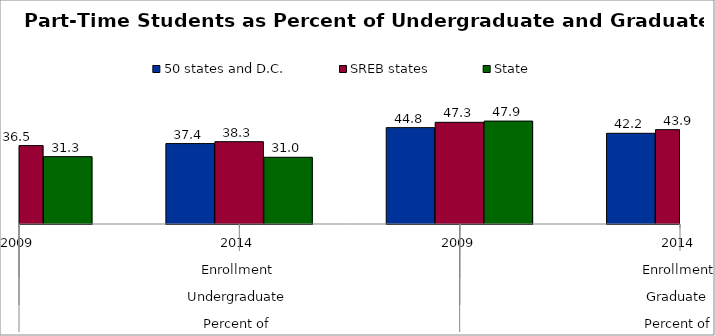
| Category | 50 states and D.C. | SREB states | State |
|---|---|---|---|
| 0 | 36.442 | 36.468 | 31.325 |
| 1 | 37.4 | 38.289 | 31.034 |
| 2 | 44.821 | 47.291 | 47.873 |
| 3 | 42.181 | 43.889 | 35.788 |